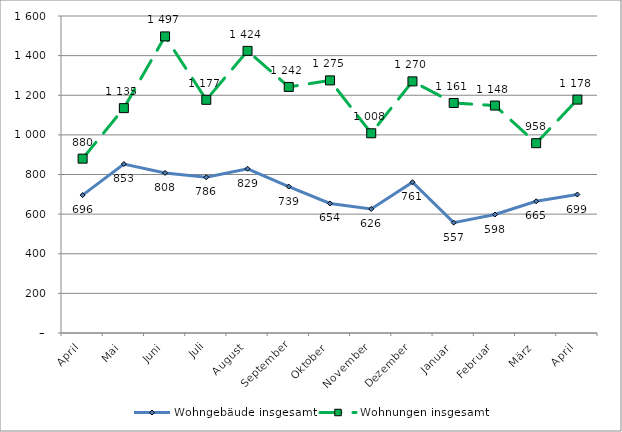
| Category | Wohngebäude insgesamt | Wohnungen insgesamt |
|---|---|---|
| April | 696 | 880 |
| Mai | 853 | 1135 |
| Juni | 808 | 1497 |
| Juli | 786 | 1177 |
| August | 829 | 1424 |
| September | 739 | 1242 |
| Oktober | 654 | 1275 |
| November | 626 | 1008 |
| Dezember | 761 | 1270 |
| Januar | 557 | 1161 |
| Februar | 598 | 1148 |
| März | 665 | 958 |
| April | 699 | 1178 |